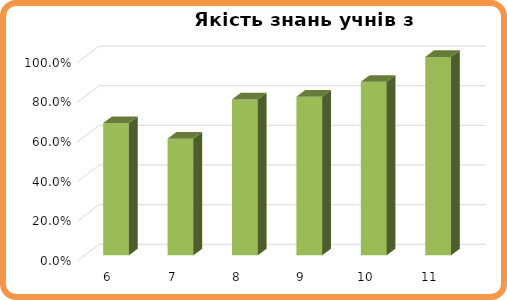
| Category | Series 0 |
|---|---|
| 6.0 | 0.667 |
| 7.0 | 0.588 |
| 8.0 | 0.786 |
| 9.0 | 0.8 |
| 10.0 | 0.875 |
| 11.0 | 1 |